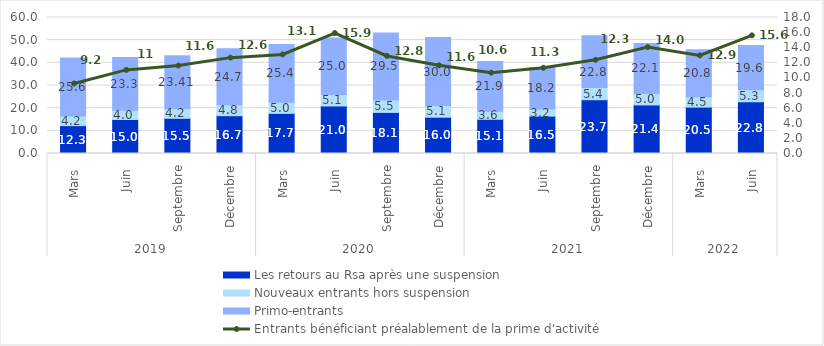
| Category | Les retours au Rsa après une suspension | Nouveaux entrants hors suspension | Primo-entrants  |
|---|---|---|---|
| 0 | 12.3 | 4.226 | 25.574 |
| 1 | 15 | 4.028 | 23.272 |
| 2 | 15.531 | 4.234 | 23.414 |
| 3 | 16.682 | 4.796 | 24.708 |
| 4 | 17.701 | 4.957 | 25.401 |
| 5 | 20.965 | 5.053 | 24.966 |
| 6 | 18.137 | 5.498 | 29.543 |
| 7 | 16.02 | 5.108 | 30.001 |
| 8 | 15.102 | 3.57 | 21.929 |
| 9 | 16.493 | 3.18 | 18.231 |
| 10 | 23.72 | 5.425 | 22.812 |
| 11 | 21.435 | 5.024 | 22.109 |
| 12 | 20.473 | 4.533 | 20.774 |
| 13 | 22.811 | 5.277 | 19.567 |